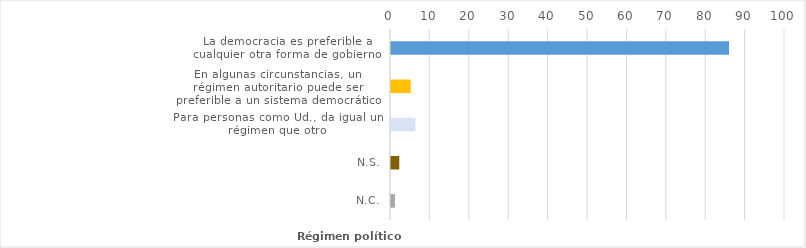
| Category | Series 0 |
|---|---|
| La democracia es preferible a cualquier otra forma de gobierno | 85.8 |
| En algunas circunstancias, un régimen autoritario puede ser preferible a un sistema democrático | 5 |
| Para personas como Ud., da igual un régimen que otro | 6.2 |
| N.S. | 2.1 |
| N.C. | 1 |